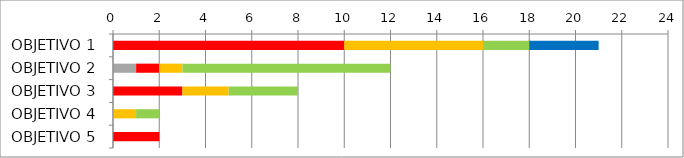
| Category | Series 1 | Series 2 | Series 3 | Series 4 | Series 5 |
|---|---|---|---|---|---|
| OBJETIVO 1 | 0 | 10 | 6 | 2 | 3 |
| OBJETIVO 2 | 1 | 1 | 1 | 9 | 0 |
| OBJETIVO 3 | 0 | 3 | 2 | 3 | 0 |
| OBJETIVO 4 | 0 | 0 | 1 | 1 | 0 |
| OBJETIVO 5 | 0 | 2 | 0 | 0 | 0 |